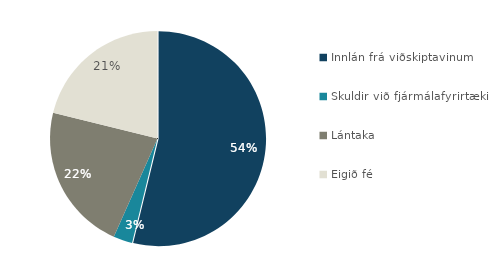
| Category | Series 0 |
|---|---|
| Innlán frá viðskiptavinum | 594565 |
| Skuldir við fjármálafyrirtæki | 31613 |
| Lántaka | 245039 |
| Eigið fé | 233894 |